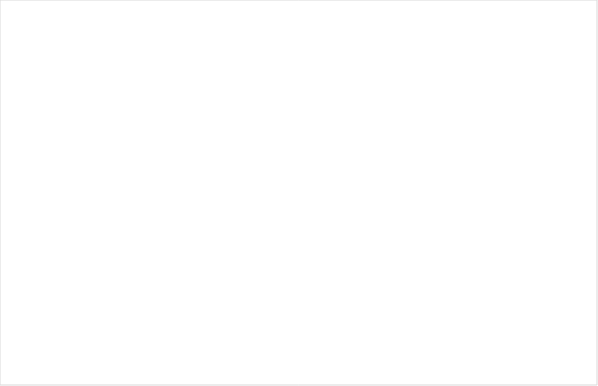
| Category | Ingen brist | Föreläggande | Föreläggande vid vite | Föreläggande/Föreläggande vid vite |
|---|---|---|---|---|
| Enskild en enhet | 0.865 | 0.096 | 0.019 | 0.019 |
| Enskild flera enhet | 0.946 | 0.041 | 0.014 | 0 |
| Offentlig | 0.976 | 0.019 | 0.002 | 0.002 |